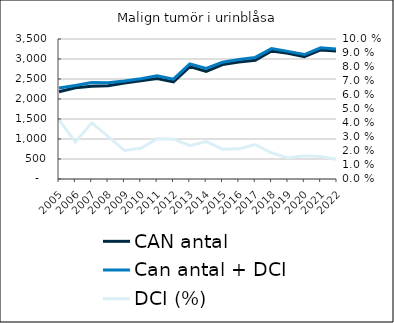
| Category |  CAN antal  |  Can antal + DCI  |
|---|---|---|
| 2005.0 | 2181 | 2273 |
| 2006.0 | 2279 | 2339 |
| 2007.0 | 2318 | 2411 |
| 2008.0 | 2333 | 2404 |
| 2009.0 | 2399 | 2448 |
| 2010.0 | 2454 | 2508 |
| 2011.0 | 2510 | 2582 |
| 2012.0 | 2428 | 2497 |
| 2013.0 | 2810 | 2877 |
| 2014.0 | 2691 | 2763 |
| 2015.0 | 2859 | 2920 |
| 2016.0 | 2926 | 2989 |
| 2017.0 | 2966 | 3039 |
| 2018.0 | 3199 | 3259 |
| 2019.0 | 3144 | 3191 |
| 2020.0 | 3060 | 3111 |
| 2021.0 | 3228 | 3280 |
| 2022.0 | 3200 | 3245 |